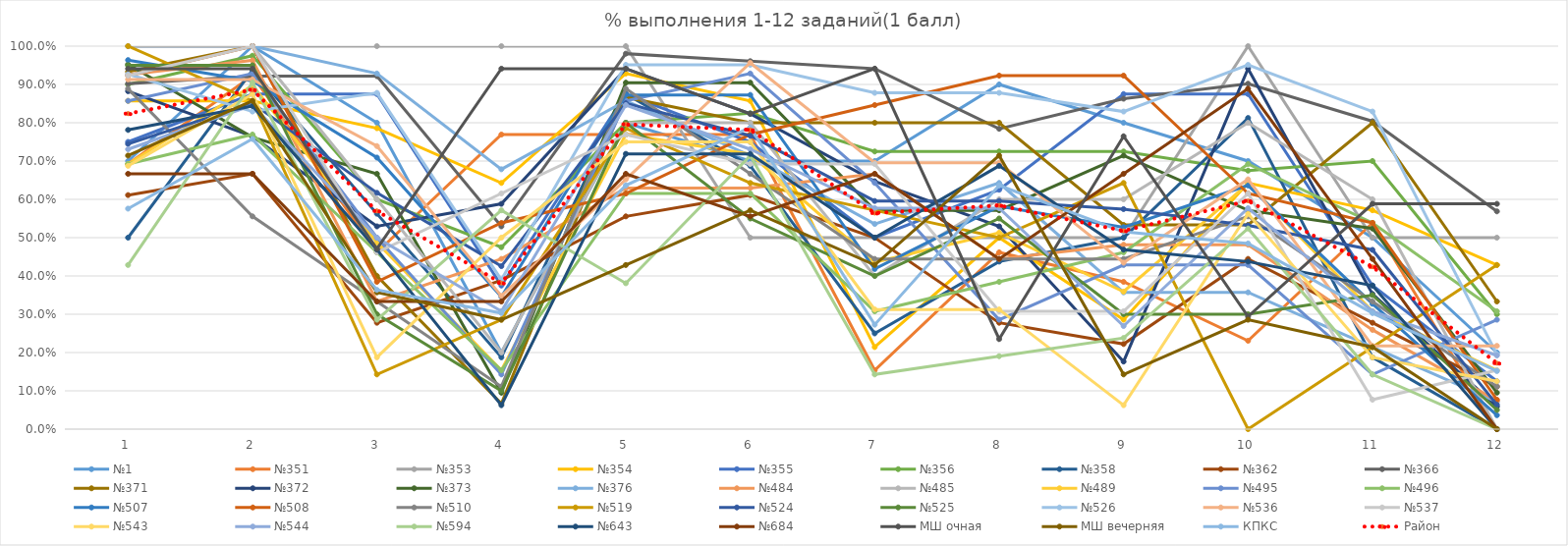
| Category | №1 | №351 | №353 | №354 | №355 | №356 | №358 | №362 | №366 | №371 | №372 | №373 | №376 | №484 | №485 | №489 | №495 | №496 | №507 | №508 | №510 | №519 | №524 | №525 | №526 | №536 | №537 | №543 | №544 | №594 | №643 | №684 | МШ очная | МШ вечерняя | КПКС | Район |
|---|---|---|---|---|---|---|---|---|---|---|---|---|---|---|---|---|---|---|---|---|---|---|---|---|---|---|---|---|---|---|---|---|---|---|---|---|
| 0 | 0.7 | 0.692 | 1 | 0.857 | 0.75 | 0.9 | 0.5 | 0.611 | 0.902 | 0.933 | 0.882 | 0.952 | 1 | 0.926 | 1 | 0.692 | 0.857 | 0.692 | 0.964 | 0.923 | 0.889 | 1 | 0.745 | 0.95 | 0.927 | 0.913 | 0.923 | 0.688 | 0.731 | 0.429 | 0.781 | 0.667 | 0.941 | 0.714 | 0.576 | 0.824 |
| 1 | 1 | 0.923 | 1 | 0.857 | 0.875 | 0.975 | 0.938 | 0.667 | 0.922 | 1 | 0.765 | 0.762 | 1 | 0.963 | 1 | 0.897 | 0.929 | 0.769 | 0.909 | 1 | 0.556 | 0.857 | 0.851 | 0.95 | 0.829 | 0.913 | 1 | 0.875 | 0.846 | 0.905 | 0.844 | 0.667 | 0.941 | 0.857 | 0.758 | 0.886 |
| 2 | 0.8 | 0.462 | 1 | 0.786 | 0.875 | 0.6 | 0.562 | 0.278 | 0.922 | 0.4 | 0.529 | 0.667 | 0.929 | 0.333 | 0.6 | 0.487 | 0.5 | 0.462 | 0.709 | 0.385 | 0.333 | 0.143 | 0.617 | 0.3 | 0.878 | 0.739 | 0.462 | 0.188 | 0.5 | 0.286 | 0.469 | 0.333 | 0.471 | 0.357 | 0.364 | 0.57 |
| 3 | 0.2 | 0.769 | 1 | 0.643 | 0.375 | 0.475 | 0.188 | 0.389 | 0.529 | 0.067 | 0.588 | 0.095 | 0.679 | 0.444 | 0.2 | 0.154 | 0.143 | 0.154 | 0.345 | 0.538 | 0.111 | 0.286 | 0.426 | 0.1 | 0.39 | 0.348 | 0.615 | 0.5 | 0.308 | 0.571 | 0.062 | 0.333 | 0.941 | 0.286 | 0.303 | 0.381 |
| 4 | 0.8 | 0.769 | 1 | 0.929 | 0.875 | 0.8 | 0.875 | 0.556 | 0.98 | 0.867 | 0.941 | 0.905 | 0.857 | 0.63 | 0.8 | 0.769 | 0.857 | 0.615 | 0.873 | 0.615 | 0.889 | 0.786 | 0.851 | 0.8 | 0.951 | 0.652 | 0.769 | 0.75 | 0.846 | 0.381 | 0.719 | 0.667 | 0.941 | 0.429 | 0.636 | 0.796 |
| 5 | 0.7 | 0.769 | 0.5 | 0.857 | 0.75 | 0.825 | 0.688 | 0.611 | 0.961 | 0.8 | 0.824 | 0.905 | 0.714 | 0.63 | 0.8 | 0.718 | 0.929 | 0.615 | 0.873 | 0.769 | 0.667 | 0.643 | 0.766 | 0.55 | 0.951 | 0.957 | 0.692 | 0.75 | 0.731 | 0.714 | 0.719 | 0.556 | 0.824 | 0.571 | 0.788 | 0.781 |
| 6 | 0.7 | 0.154 | 0.5 | 0.214 | 0.5 | 0.725 | 0.25 | 0.5 | 0.941 | 0.8 | 0.647 | 0.571 | 0.536 | 0.667 | 0.4 | 0.436 | 0.643 | 0.308 | 0.418 | 0.846 | 0.444 | 0.571 | 0.596 | 0.4 | 0.878 | 0.696 | 0.692 | 0.312 | 0.577 | 0.143 | 0.5 | 0.667 | 0.941 | 0.429 | 0.273 | 0.564 |
| 7 | 0.9 | 0.462 | 0.5 | 0.5 | 0.625 | 0.725 | 0.438 | 0.278 | 0.784 | 0.8 | 0.529 | 0.571 | 0.643 | 0.444 | 0.6 | 0.513 | 0.286 | 0.385 | 0.582 | 0.923 | 0.444 | 0.5 | 0.596 | 0.55 | 0.878 | 0.696 | 0.308 | 0.312 | 0.577 | 0.19 | 0.688 | 0.444 | 0.235 | 0.714 | 0.636 | 0.584 |
| 8 | 0.8 | 0.385 | 0.5 | 0.286 | 0.875 | 0.725 | 0.5 | 0.222 | 0.863 | 0.533 | 0.176 | 0.714 | 0.357 | 0.481 | 0.6 | 0.359 | 0.429 | 0.462 | 0.527 | 0.923 | 0.444 | 0.643 | 0.574 | 0.3 | 0.829 | 0.435 | 0.308 | 0.062 | 0.269 | 0.238 | 0.469 | 0.667 | 0.765 | 0.143 | 0.515 | 0.518 |
| 9 | 0.7 | 0.231 | 1 | 0.643 | 0.875 | 0.675 | 0.812 | 0.444 | 0.902 | 0.533 | 0.941 | 0.571 | 0.357 | 0.481 | 0.8 | 0.641 | 0.429 | 0.692 | 0.636 | 0.615 | 0.556 | 0 | 0.532 | 0.3 | 0.951 | 0.652 | 0.615 | 0.562 | 0.577 | 0.524 | 0.438 | 0.889 | 0.294 | 0.286 | 0.485 | 0.596 |
| 10 | 0.5 | 0.538 | 0.5 | 0.571 | 0.375 | 0.7 | 0.188 | 0.278 | 0.804 | 0.8 | 0.353 | 0.524 | 0.214 | 0.259 | 0.6 | 0.308 | 0.143 | 0.538 | 0.327 | 0.538 | 0.333 | 0.214 | 0.468 | 0.35 | 0.829 | 0.217 | 0.077 | 0.188 | 0.308 | 0.143 | 0.375 | 0.444 | 0.588 | 0.214 | 0.303 | 0.424 |
| 11 | 0.2 | 0 | 0.5 | 0.429 | 0.125 | 0.3 | 0 | 0.111 | 0.569 | 0.333 | 0.059 | 0.095 | 0.071 | 0.074 | 0 | 0.154 | 0.286 | 0.308 | 0.036 | 0.077 | 0.111 | 0.429 | 0.064 | 0.05 | 0.195 | 0.217 | 0.154 | 0.125 | 0.192 | 0 | 0 | 0 | 0.588 | 0 | 0.152 | 0.172 |